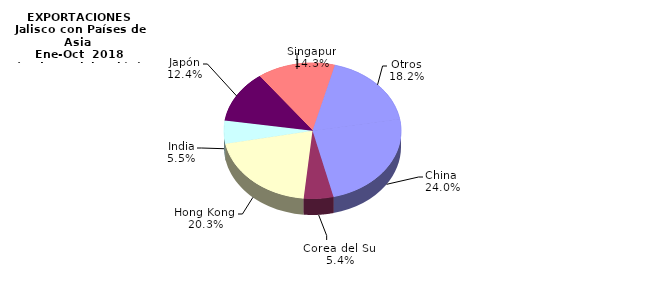
| Category | EXPORTACIONES |
|---|---|
| China  | 555.827 |
| Corea del Sur | 124.772 |
| Hong Kong  | 471.069 |
| India | 126.785 |
| Japón | 287.482 |
| Singapur | 330.501 |
| Otros | 420.851 |